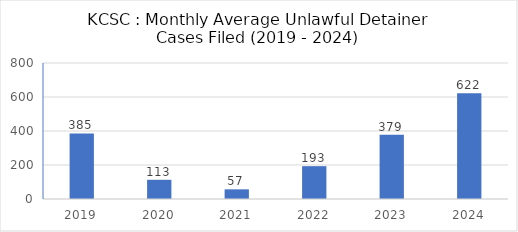
| Category | Series 0 |
|---|---|
| 2019.0 | 385.417 |
| 2020.0 | 113 |
| 2021.0 | 56.833 |
| 2022.0 | 193.083 |
| 2023.0 | 378.5 |
| 2024.0 | 622 |